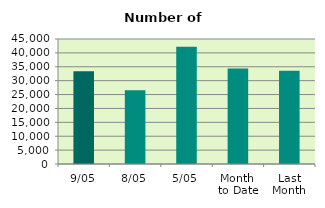
| Category | Series 0 |
|---|---|
| 9/05 | 33360 |
| 8/05 | 26560 |
| 5/05 | 42244 |
| Month 
to Date | 34351 |
| Last
Month | 33588.111 |